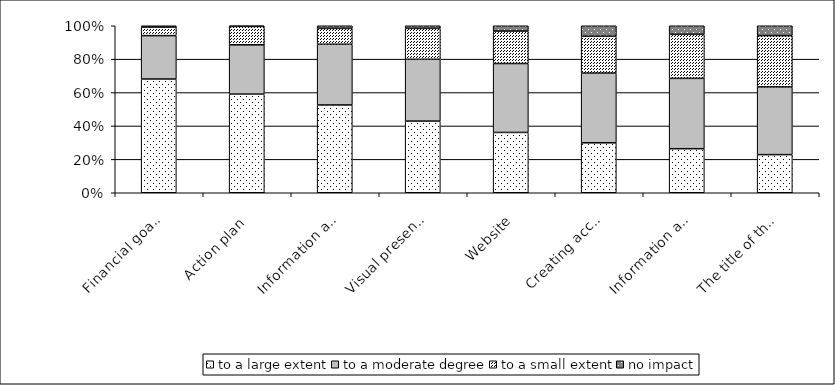
| Category | to a large extent | to a moderate degree | to a small extent | no impact |
|---|---|---|---|---|
| Financial goal and budget | 173 | 66 | 13 | 2 |
| Action plan | 150 | 75 | 28 | 1 |
| Information about the project | 133 | 92 | 24 | 4 |
| Visual presentation | 109 | 94 | 47 | 4 |
| Website | 91 | 104 | 49 | 8 |
| Creating accounts | 76 | 106 | 56 | 16 |
| Information about prizes | 67 | 107 | 67 | 13 |
| The title of the project | 58 | 103 | 78 | 15 |